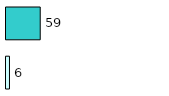
| Category | Series 0 | Series 1 |
|---|---|---|
| 0 | 6 | 59 |